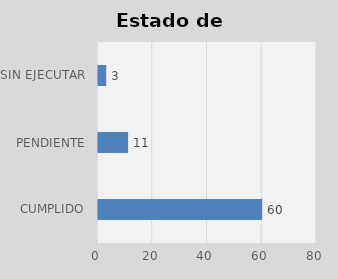
| Category | Total |
|---|---|
| CUMPLIDO | 60 |
| PENDIENTE | 11 |
| SIN EJECUTAR | 3 |